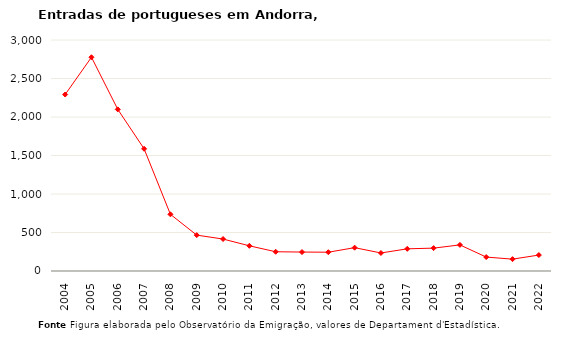
| Category | Entradas |
|---|---|
| 2004.0 | 2292 |
| 2005.0 | 2776 |
| 2006.0 | 2099 |
| 2007.0 | 1587 |
| 2008.0 | 736 |
| 2009.0 | 466 |
| 2010.0 | 415 |
| 2011.0 | 327 |
| 2012.0 | 250 |
| 2013.0 | 246 |
| 2014.0 | 244 |
| 2015.0 | 303 |
| 2016.0 | 234 |
| 2017.0 | 288 |
| 2018.0 | 297 |
| 2019.0 | 339 |
| 2020.0 | 181 |
| 2021.0 | 154 |
| 2022.0 | 207 |